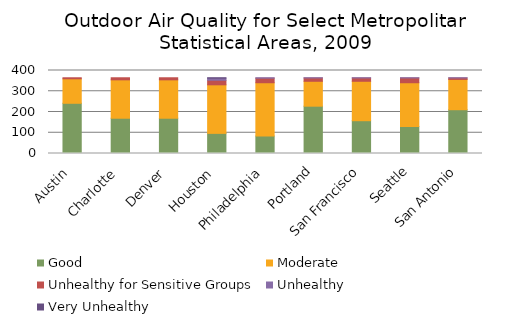
| Category | Good | Moderate | Unhealthy for Sensitive Groups | Unhealthy   | Very Unhealthy |
|---|---|---|---|---|---|
| Austin | 242 | 118 | 5 | 0 | 0 |
| Charlotte | 170 | 185 | 10 | 0 | 0 |
| Denver | 170 | 185 | 10 | 0 | 0 |
| Houston | 97 | 234 | 22 | 10 | 2 |
| Philadelphia | 84 | 257 | 22 | 2 | 0 |
| Portland | 228 | 120 | 16 | 1 | 0 |
| San Francisco | 158 | 190 | 16 | 1 | 0 |
| Seattle | 130 | 211 | 23 | 1 | 0 |
| San Antonio | 211 | 146 | 7 | 1 | 0 |